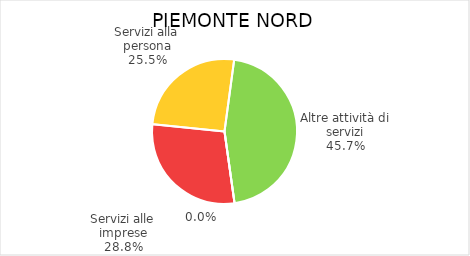
| Category | Piemonte Nord |
|---|---|
| Servizi alle imprese | 6870 |
| Servizi alla persona | 6084 |
| Altre attività di servizi | 10877 |